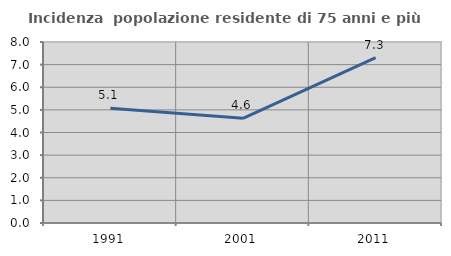
| Category | Incidenza  popolazione residente di 75 anni e più |
|---|---|
| 1991.0 | 5.07 |
| 2001.0 | 4.629 |
| 2011.0 | 7.312 |